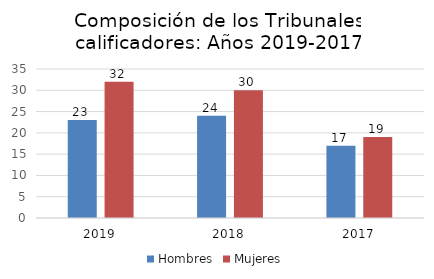
| Category | Hombres | Mujeres |
|---|---|---|
| 0 | 23 | 32 |
| 1 | 24 | 30 |
| 2 | 17 | 19 |